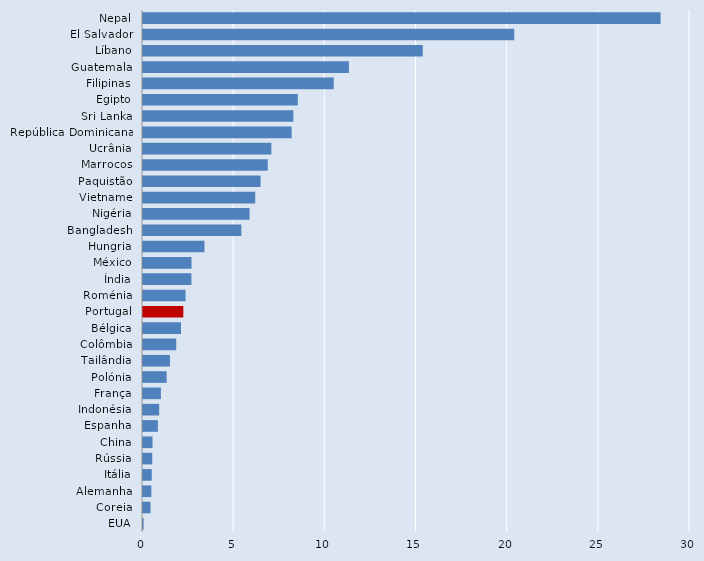
| Category | Series 0 |
|---|---|
| Nepal | 28.386 |
| El Salvador | 20.361 |
| Líbano | 15.343 |
| Guatemala | 11.293 |
| Filipinas | 10.462 |
| Egipto | 8.49 |
| Sri Lanka | 8.248 |
| República Dominicana | 8.153 |
| Ucrânia | 7.039 |
| Marrocos | 6.842 |
| Paquistão | 6.448 |
| Vietname | 6.156 |
| Nigéria | 5.846 |
| Bangladesh | 5.394 |
| Hungria | 3.372 |
| México | 2.661 |
| Índia | 2.655 |
| Roménia | 2.334 |
| Portugal | 2.211 |
| Bélgica | 2.085 |
| Colômbia | 1.823 |
| Tailândia | 1.478 |
| Polónia | 1.297 |
| França | 0.982 |
| Indonésia | 0.886 |
| Espanha | 0.815 |
| China | 0.522 |
| Rússia | 0.509 |
| Itália | 0.48 |
| Alemanha | 0.458 |
| Coreia | 0.414 |
| EUA | 0.034 |